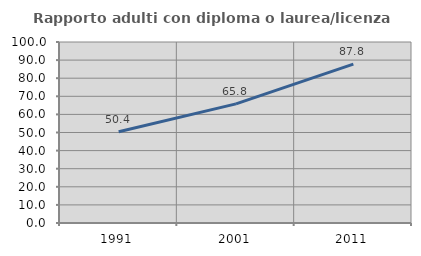
| Category | Rapporto adulti con diploma o laurea/licenza media  |
|---|---|
| 1991.0 | 50.413 |
| 2001.0 | 65.799 |
| 2011.0 | 87.762 |